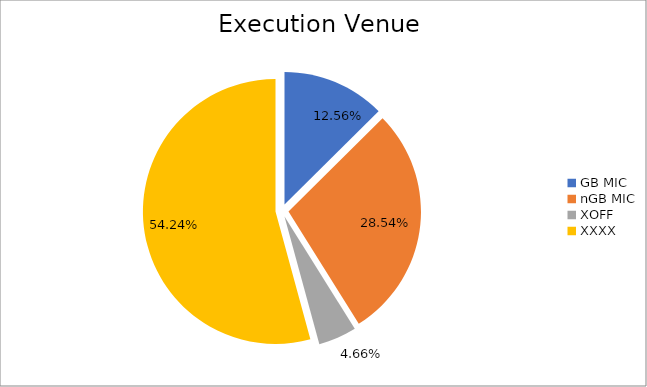
| Category | Series 0 |
|---|---|
| GB MIC | 1157061.572 |
| nGB MIC | 2628275.527 |
| XOFF | 429209.936 |
| XXXX | 4995282.676 |